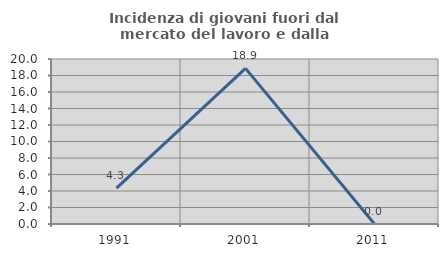
| Category | Incidenza di giovani fuori dal mercato del lavoro e dalla formazione  |
|---|---|
| 1991.0 | 4.348 |
| 2001.0 | 18.868 |
| 2011.0 | 0 |